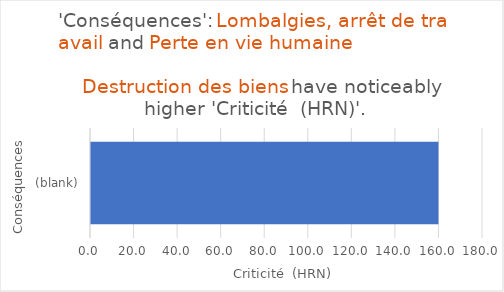
| Category | Total |
|---|---|
| (blank) | 160 |